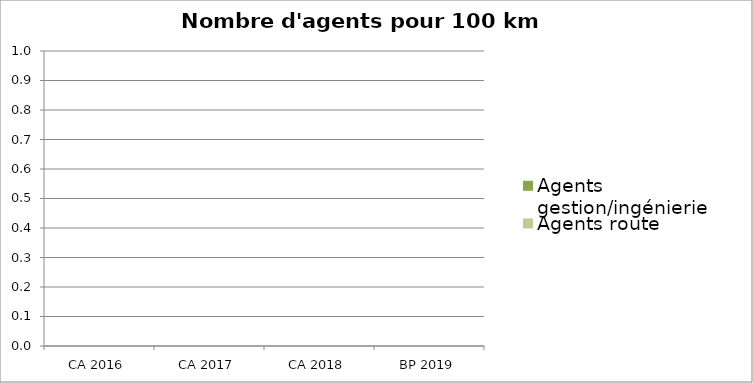
| Category | Agents gestion/ingénierie | Agents route |
|---|---|---|
| CA 2016 | 0 | 0 |
| CA 2017 | 0 | 0 |
| CA 2018 | 0 | 0 |
| BP 2019 | 0 | 0 |